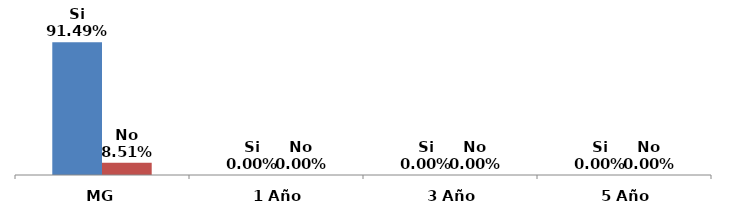
| Category | Si | No |
|---|---|---|
| MG | 0.915 | 0.085 |
| 1 Año | 0 | 0 |
| 3 Año | 0 | 0 |
| 5 Año | 0 | 0 |